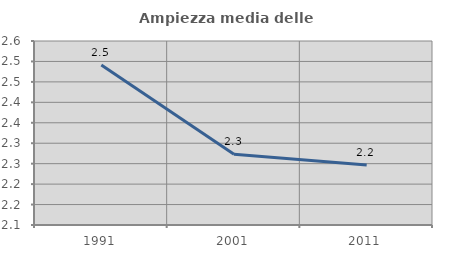
| Category | Ampiezza media delle famiglie |
|---|---|
| 1991.0 | 2.491 |
| 2001.0 | 2.273 |
| 2011.0 | 2.247 |